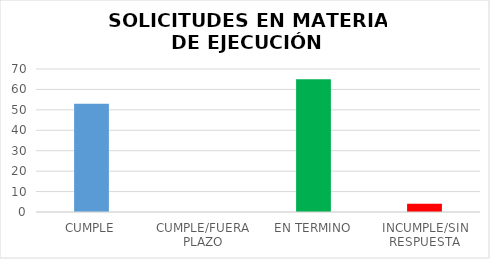
| Category | Series 0 |
|---|---|
| CUMPLE | 53 |
| CUMPLE/FUERA PLAZO | 0 |
| EN TERMINO | 65 |
| INCUMPLE/SIN RESPUESTA | 4 |